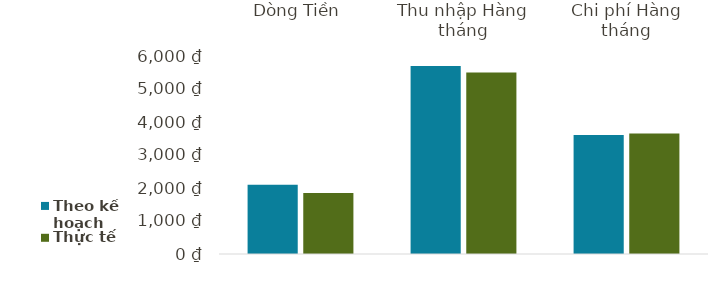
| Category | Theo kế hoạch | Thực tế |
|---|---|---|
| Dòng Tiền | 2097 | 1845 |
| Thu nhập Hàng tháng | 5700 | 5500 |
| Chi phí Hàng tháng | 3603 | 3655 |